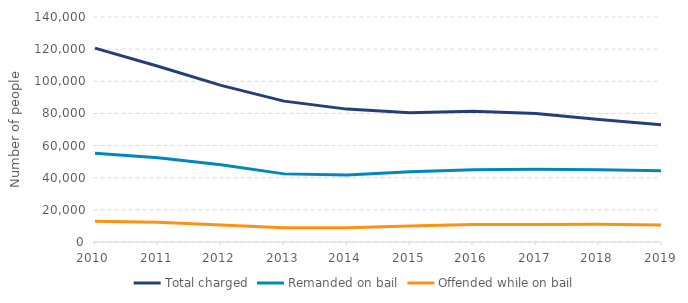
| Category | Total charged | Remanded on bail | Offended while on bail |
|---|---|---|---|
| 2010.0 | 120631 | 55202 | 12938 |
| 2011.0 | 109364 | 52459 | 12245 |
| 2012.0 | 97429 | 48003 | 10594 |
| 2013.0 | 87654 | 42388 | 8911 |
| 2014.0 | 82681 | 41699 | 8925 |
| 2015.0 | 80385 | 43657 | 9992 |
| 2016.0 | 81320 | 44998 | 10938 |
| 2017.0 | 79983 | 45207 | 10900 |
| 2018.0 | 76187 | 44981 | 11101 |
| 2019.0 | 72897 | 44351 | 10621 |